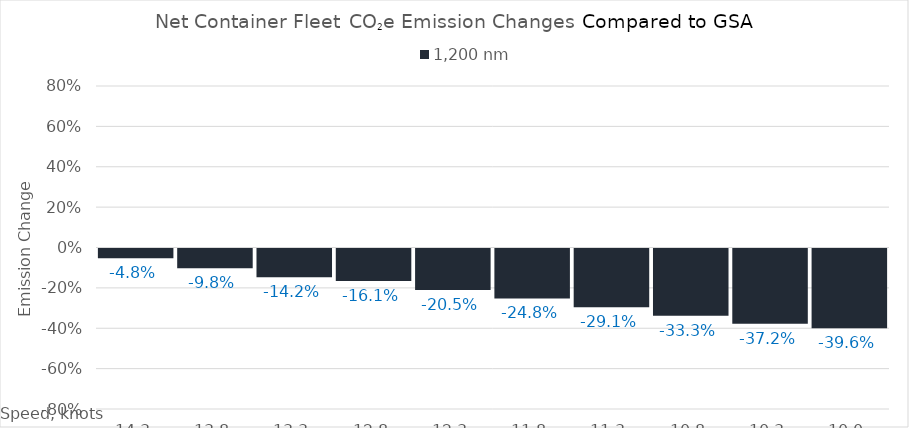
| Category | 1,200 |
|---|---|
| 14.3 | -0.048 |
| 13.8 | -0.098 |
| 13.3 | -0.142 |
| 12.8 | -0.161 |
| 12.3 | -0.205 |
| 11.8 | -0.248 |
| 11.3 | -0.291 |
| 10.8 | -0.333 |
| 10.3 | -0.372 |
| 10.0 | -0.396 |